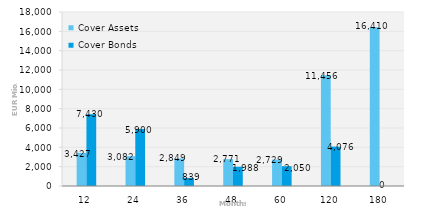
| Category | Cover Assets | Cover Bonds |
|---|---|---|
| 12.0 | 3426.738 | 7430 |
| 24.0 | 3081.841 | 5900 |
| 36.0 | 2849.431 | 839.444 |
| 48.0 | 2771.227 | 1988 |
| 60.0 | 2729.478 | 2050 |
| 120.0 | 11456.275 | 4076.41 |
| 180.0 | 16409.663 | 0 |